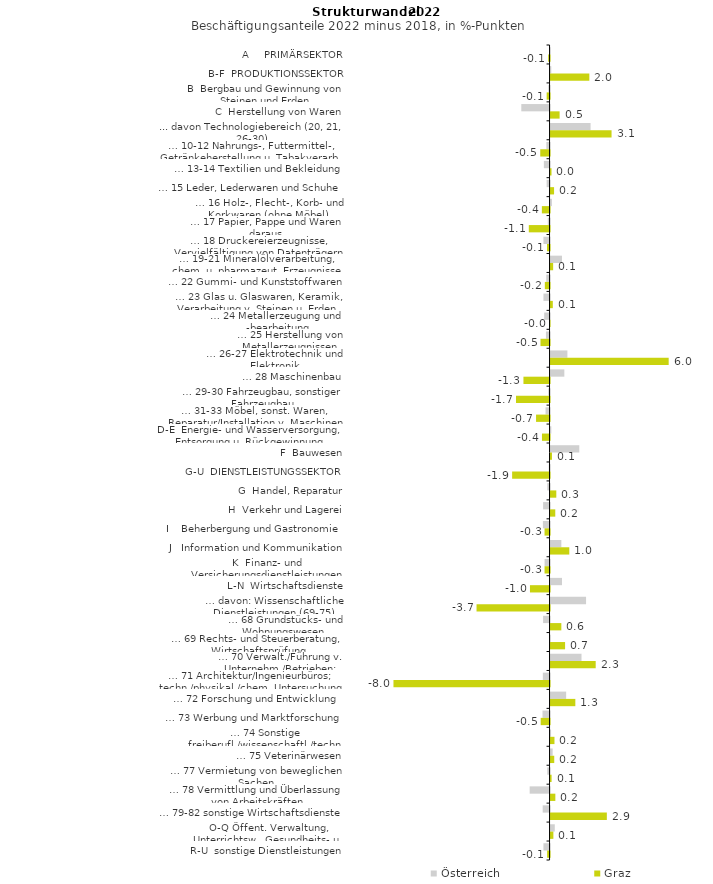
| Category | Österreich | Graz |
|---|---|---|
| A     PRIMÄRSEKTOR | 0.004 | -0.07 |
| B-F  PRODUKTIONSSEKTOR | 0.036 | 1.983 |
| B  Bergbau und Gewinnung von Steinen und Erden | -0.063 | -0.148 |
| C  Herstellung von Waren | -1.445 | 0.463 |
| ... davon Technologiebereich (20, 21, 26-30) | 2.047 | 3.119 |
| … 10-12 Nahrungs-, Futtermittel-, Getränkeherstellung u. Tabakverarb. | -0.163 | -0.475 |
| … 13-14 Textilien und Bekleidung | -0.292 | 0.048 |
| … 15 Leder, Lederwaren und Schuhe | -0.15 | 0.18 |
| … 16 Holz-, Flecht-, Korb- und Korkwaren (ohne Möbel)  | 0.068 | -0.394 |
| … 17 Papier, Pappe und Waren daraus  | -0.09 | -1.061 |
| … 18 Druckereierzeugnisse, Vervielfältigung von Datenträgern | -0.314 | -0.131 |
| … 19-21 Mineralölverarbeitung, chem. u. pharmazeut. Erzeugnisse | 0.584 | 0.133 |
| … 22 Gummi- und Kunststoffwaren | -0.168 | -0.241 |
| … 23 Glas u. Glaswaren, Keramik, Verarbeitung v. Steinen u. Erden  | -0.312 | 0.116 |
| … 24 Metallerzeugung und -bearbeitung | -0.276 | -0.006 |
| … 25 Herstellung von Metallerzeugnissen  | -0.185 | -0.463 |
| … 26-27 Elektrotechnik und Elektronik | 0.862 | 6.04 |
| … 28 Maschinenbau | 0.705 | -1.335 |
| … 29-30 Fahrzeugbau, sonstiger Fahrzeugbau | -0.066 | -1.715 |
| … 31-33 Möbel, sonst. Waren, Reparatur/Installation v. Maschinen | -0.204 | -0.691 |
| D-E  Energie- und Wasserversorgung, Entsorgung u. Rückgewinnung | 0.038 | -0.388 |
| F  Bauwesen | 1.469 | 0.072 |
| G-U  DIENSTLEISTUNGSSEKTOR | -0.04 | -1.914 |
| G  Handel, Reparatur | -0.115 | 0.294 |
| H  Verkehr und Lagerei | -0.33 | 0.241 |
| I    Beherbergung und Gastronomie | -0.34 | -0.256 |
| J   Information und Kommunikation | 0.551 | 0.959 |
| K  Finanz- und Versicherungsdienstleistungen | -0.255 | -0.256 |
| L-N  Wirtschaftsdienste | 0.586 | -1.002 |
| … davon: Wissenschaftliche Dienstleistungen (69-75) | 1.815 | -3.734 |
| … 68 Grundstücks- und Wohnungswesen  | -0.331 | 0.552 |
| … 69 Rechts- und Steuerberatung, Wirtschaftsprüfung | 0.008 | 0.743 |
| … 70 Verwalt./Führung v. Unternehm./Betrieben; Unternehmensberat. | 1.583 | 2.308 |
| … 71 Architektur/Ingenieurbüros; techn./physikal./chem. Untersuchung | -0.344 | -7.982 |
| … 72 Forschung und Entwicklung  | 0.797 | 1.267 |
| … 73 Werbung und Marktforschung | -0.361 | -0.454 |
| … 74 Sonstige freiberufl./wissenschaftl./techn. Tätigkeiten | 0.025 | 0.2 |
| … 75 Veterinärwesen | 0.108 | 0.188 |
| … 77 Vermietung von beweglichen Sachen  | -0.116 | 0.053 |
| … 78 Vermittlung und Überlassung von Arbeitskräften | -1.018 | 0.245 |
| … 79-82 sonstige Wirtschaftsdienste | -0.351 | 2.879 |
| O-Q Öffent. Verwaltung, Unterrichtsw., Gesundheits- u. Sozialwesen | 0.216 | 0.144 |
| R-U  sonstige Dienstleistungen | -0.314 | -0.123 |